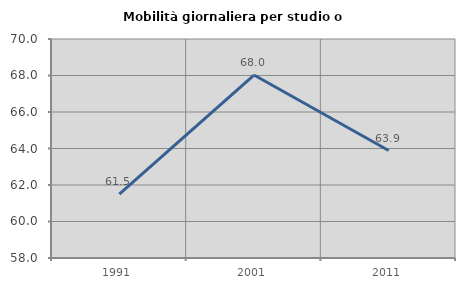
| Category | Mobilità giornaliera per studio o lavoro |
|---|---|
| 1991.0 | 61.504 |
| 2001.0 | 68.027 |
| 2011.0 | 63.889 |